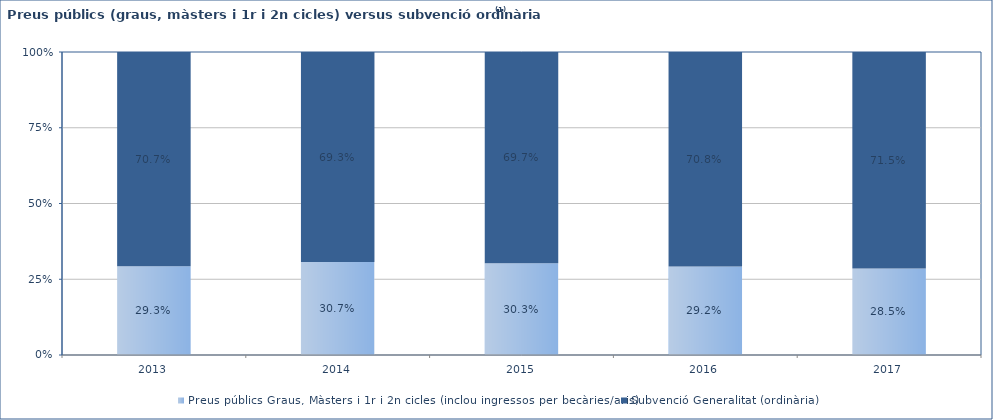
| Category | Preus públics Graus, Màsters i 1r i 2n cicles (inclou ingressos per becàries/aris) | Subvenció Generalitat (ordinària) |
|---|---|---|
| 2013.0 | 0.293 | 0.707 |
| 2014.0 | 0.307 | 0.693 |
| 2015.0 | 0.303 | 0.697 |
| 2016.0 | 0.292 | 0.708 |
| 2017.0 | 0.285 | 0.715 |